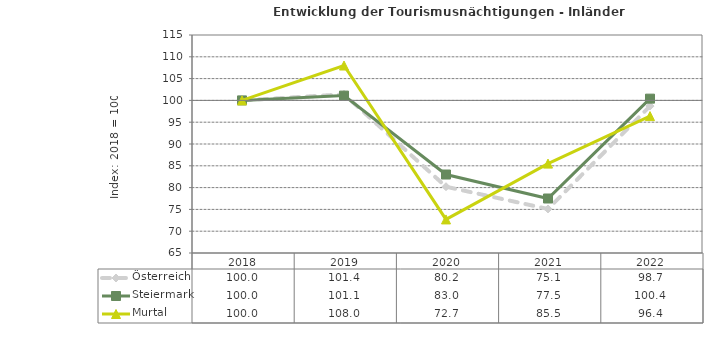
| Category | Österreich | Steiermark | Murtal |
|---|---|---|---|
| 2022.0 | 98.7 | 100.4 | 96.4 |
| 2021.0 | 75.1 | 77.5 | 85.5 |
| 2020.0 | 80.2 | 83 | 72.7 |
| 2019.0 | 101.4 | 101.1 | 108 |
| 2018.0 | 100 | 100 | 100 |